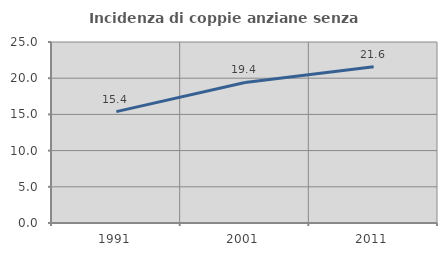
| Category | Incidenza di coppie anziane senza figli  |
|---|---|
| 1991.0 | 15.385 |
| 2001.0 | 19.412 |
| 2011.0 | 21.569 |